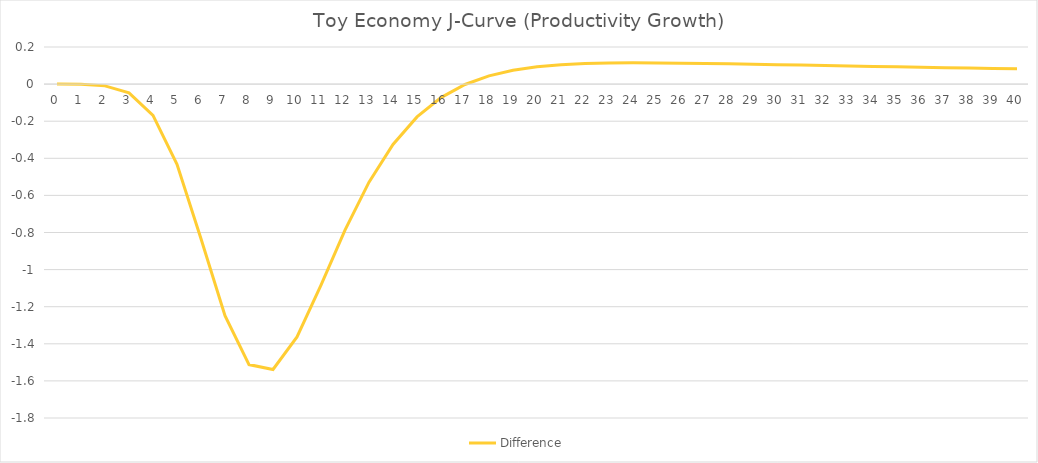
| Category | Difference |
|---|---|
| 0.0 | 0 |
| 1.0 | -0.001 |
| 2.0 | -0.01 |
| 3.0 | -0.048 |
| 4.0 | -0.168 |
| 5.0 | -0.432 |
| 6.0 | -0.833 |
| 7.0 | -1.249 |
| 8.0 | -1.512 |
| 9.0 | -1.538 |
| 10.0 | -1.363 |
| 11.0 | -1.083 |
| 12.0 | -0.788 |
| 13.0 | -0.529 |
| 14.0 | -0.326 |
| 15.0 | -0.177 |
| 16.0 | -0.073 |
| 17.0 | -0.002 |
| 18.0 | 0.044 |
| 19.0 | 0.074 |
| 20.0 | 0.093 |
| 21.0 | 0.104 |
| 22.0 | 0.11 |
| 23.0 | 0.114 |
| 24.0 | 0.115 |
| 25.0 | 0.114 |
| 26.0 | 0.113 |
| 27.0 | 0.111 |
| 28.0 | 0.109 |
| 29.0 | 0.107 |
| 30.0 | 0.105 |
| 31.0 | 0.102 |
| 32.0 | 0.1 |
| 33.0 | 0.098 |
| 34.0 | 0.095 |
| 35.0 | 0.093 |
| 36.0 | 0.091 |
| 37.0 | 0.089 |
| 38.0 | 0.086 |
| 39.0 | 0.084 |
| 40.0 | 0.082 |